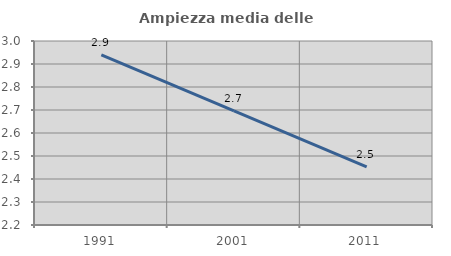
| Category | Ampiezza media delle famiglie |
|---|---|
| 1991.0 | 2.94 |
| 2001.0 | 2.696 |
| 2011.0 | 2.453 |